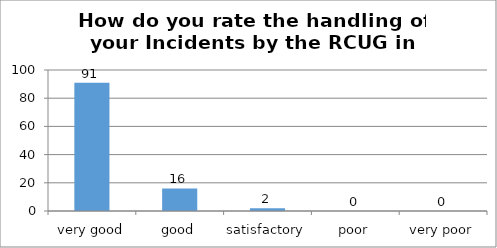
| Category | How do you rate the handling of your Incidents by the RCUG in 2020? |
|---|---|
| very good | 91 |
| good | 16 |
| satisfactory | 2 |
| poor | 0 |
| very poor | 0 |